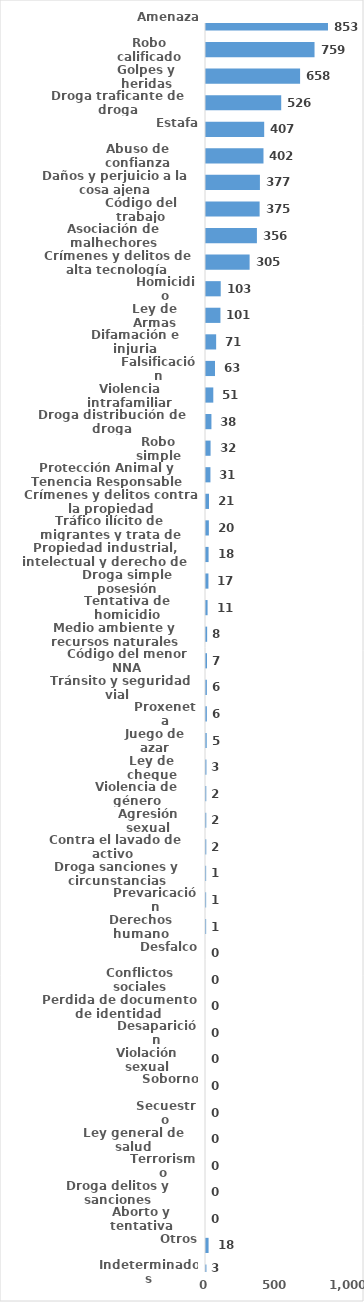
| Category | Series 0 |
|---|---|
| Amenaza | 853 |
| Robo calificado | 759 |
| Golpes y heridas | 658 |
| Droga traficante de droga | 526 |
| Estafa | 407 |
| Abuso de confianza | 402 |
| Daños y perjuicio a la cosa ajena | 377 |
| Código del trabajo | 375 |
| Asociación de malhechores | 356 |
| Crímenes y delitos de alta tecnología | 305 |
| Homicidio | 103 |
| Ley de Armas | 101 |
| Difamación e injuria | 71 |
| Falsificación | 63 |
| Violencia intrafamiliar | 51 |
| Droga distribución de droga | 38 |
| Robo simple | 32 |
| Protección Animal y Tenencia Responsable | 31 |
| Crímenes y delitos contra la propiedad | 21 |
| Tráfico ilícito de migrantes y trata de personas | 20 |
| Propiedad industrial, intelectual y derecho de autor | 18 |
| Droga simple posesión | 17 |
| Tentativa de homicidio | 11 |
| Medio ambiente y recursos naturales | 8 |
| Código del menor NNA | 7 |
| Tránsito y seguridad vial  | 6 |
| Proxeneta | 6 |
| Juego de azar | 5 |
| Ley de cheque | 3 |
| Violencia de género | 2 |
| Agresión sexual | 2 |
| Contra el lavado de activo  | 2 |
| Droga sanciones y circunstancias agravantes | 1 |
| Prevaricación | 1 |
| Derechos humano | 1 |
| Desfalco | 0 |
| Conflictos sociales | 0 |
| Perdida de documento de identidad | 0 |
| Desaparición | 0 |
| Violación sexual | 0 |
| Soborno | 0 |
| Secuestro | 0 |
| Ley general de salud | 0 |
| Terrorismo | 0 |
| Droga delitos y sanciones | 0 |
| Aborto y tentativa | 0 |
| Otros | 18 |
| Indeterminados | 3 |